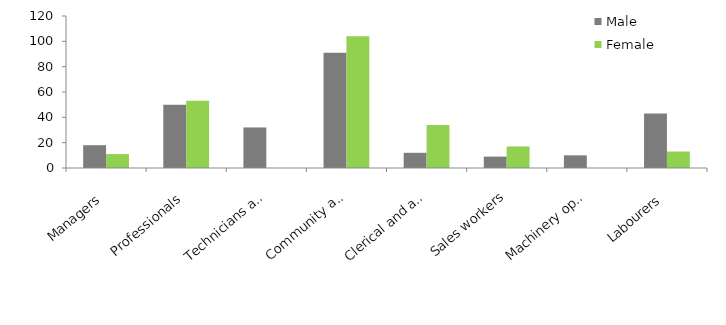
| Category | Male | Female |
|---|---|---|
| Managers | 18 | 11 |
| Professionals | 50 | 53 |
| Technicians and trades workers | 32 | 0 |
| Community and personal service workers | 91 | 104 |
| Clerical and administrative workers | 12 | 34 |
| Sales workers | 9 | 17 |
| Machinery operators and drivers | 10 | 0 |
| Labourers | 43 | 13 |